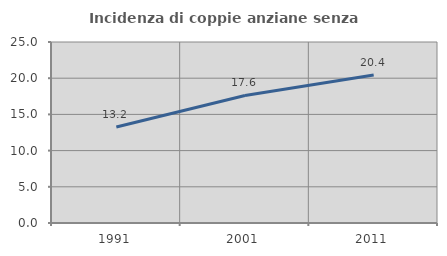
| Category | Incidenza di coppie anziane senza figli  |
|---|---|
| 1991.0 | 13.248 |
| 2001.0 | 17.611 |
| 2011.0 | 20.45 |